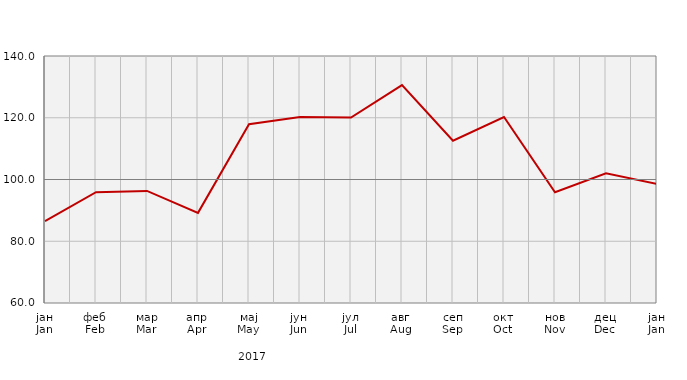
| Category | Индекси ноћења туриста
Tourist night indices |
|---|---|
| јан
Jan | 86.514 |
| феб
Feb | 95.907 |
| мар
Mar | 96.311 |
| апр
Apr | 89.193 |
| мај
May | 117.906 |
| јун
Jun | 120.259 |
| јул
Jul | 120.08 |
| авг
Aug | 130.596 |
| сеп
Sep | 112.544 |
| окт
Oct | 120.238 |
| нов
Nov | 95.857 |
| дец
Dec | 101.993 |
| јан
Jan | 98.549 |